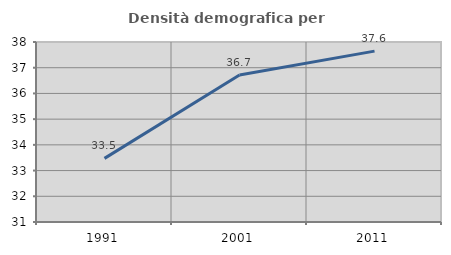
| Category | Densità demografica |
|---|---|
| 1991.0 | 33.474 |
| 2001.0 | 36.718 |
| 2011.0 | 37.644 |